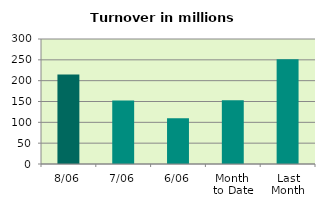
| Category | Series 0 |
|---|---|
| 8/06 | 214.861 |
| 7/06 | 152.608 |
| 6/06 | 109.52 |
| Month 
to Date | 153.237 |
| Last
Month | 251.573 |